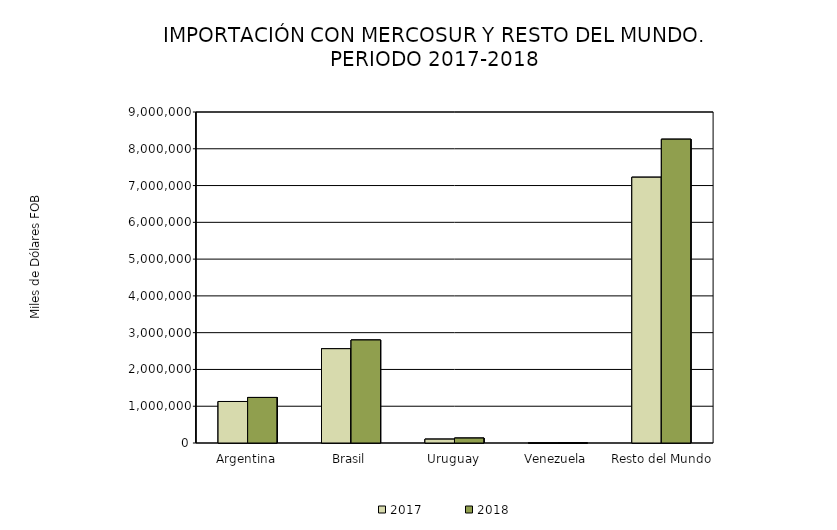
| Category | 2017 | 2018 |
|---|---|---|
| Argentina | 1128708.685 | 1238285.287 |
| Brasil | 2564080.658 | 2801025.498 |
| Uruguay | 104826 | 134181.34 |
| Venezuela | 3342.793 | 207.275 |
| Resto del Mundo | 7226420.864 | 8260180.76 |